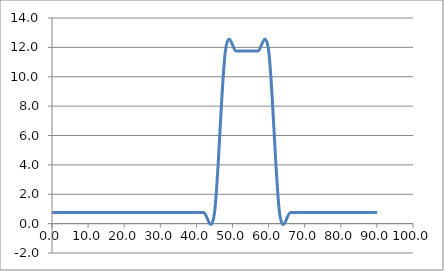
| Category | Elevation (in.) |
|---|---|
| 0.024 | 0.75 |
| 3.024 | 0.75 |
| 6.024 | 0.75 |
| 9.024000000000001 | 0.75 |
| 12.024000000000001 | 0.75 |
| 15.024000000000001 | 0.75 |
| 18.024 | 0.75 |
| 21.024 | 0.75 |
| 24.023999999999997 | 0.75 |
| 27.023999999999997 | 0.75 |
| 30.023999999999997 | 0.75 |
| 33.024 | 0.75 |
| 36.024 | 0.75 |
| 39.024 | 0.75 |
| 42.024 | 0.75 |
| 45.024 | 0.75 |
| 48.024 | 11.75 |
| 51.024 | 11.75 |
| 54.024 | 11.75 |
| 57.024 | 11.75 |
| 60.024 | 11.75 |
| 63.024 | 0.75 |
| 66.024 | 0.75 |
| 69.024 | 0.75 |
| 72.024 | 0.75 |
| 75.024 | 0.75 |
| 78.024 | 0.75 |
| 81.024 | 0.75 |
| 84.024 | 0.75 |
| 87.024 | 0.75 |
| 90.024 | 0.75 |